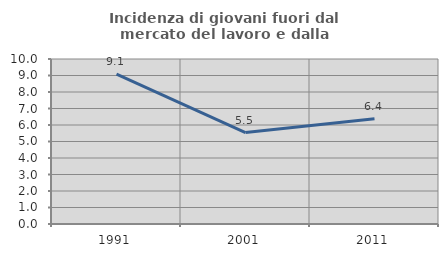
| Category | Incidenza di giovani fuori dal mercato del lavoro e dalla formazione  |
|---|---|
| 1991.0 | 9.082 |
| 2001.0 | 5.543 |
| 2011.0 | 6.381 |